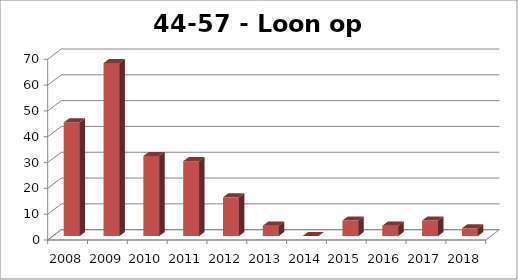
| Category | Loon op Zand |
|---|---|
| 2008.0 | 44 |
| 2009.0 | 67 |
| 2010.0 | 31 |
| 2011.0 | 29 |
| 2012.0 | 15 |
| 2013.0 | 4 |
| 2014.0 | 0 |
| 2015.0 | 6 |
| 2016.0 | 4 |
| 2017.0 | 6 |
| 2018.0 | 3 |